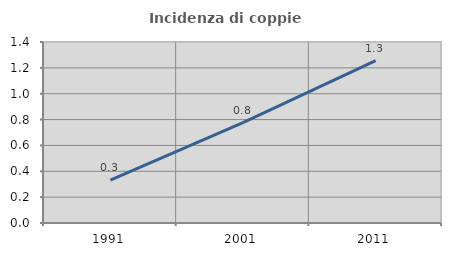
| Category | Incidenza di coppie miste |
|---|---|
| 1991.0 | 0.332 |
| 2001.0 | 0.776 |
| 2011.0 | 1.256 |